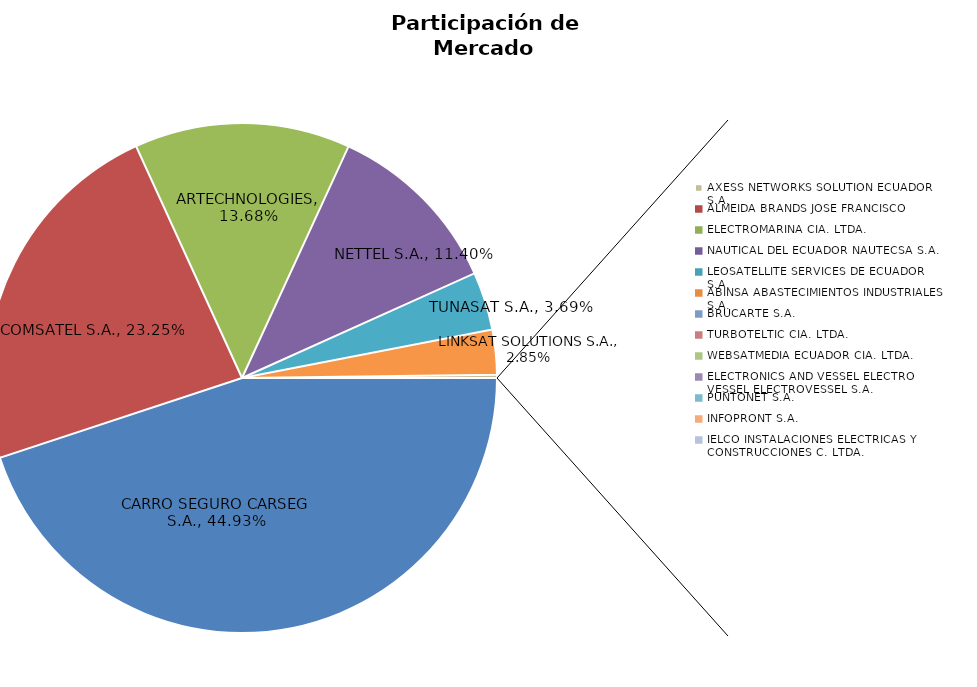
| Category | Series 0 |
|---|---|
| CARRO SEGURO CARSEG S.A. | 0.449 |
| COMSATEL S.A. | 0.233 |
| ARTECHNOLOGIES | 0.137 |
| NETTEL S.A. | 0.114 |
| TUNASAT S.A. | 0.037 |
| LINKSAT SOLUTIONS S.A. | 0.029 |
| AXESS NETWORKS SOLUTION ECUADOR S.A. | 0.002 |
| ALMEIDA BRANDS JOSE FRANCISCO | 0 |
| ELECTROMARINA CIA. LTDA. | 0 |
| NAUTICAL DEL ECUADOR NAUTECSA S.A. | 0 |
| LEOSATELLITE SERVICES DE ECUADOR S.A. | 0 |
| ABINSA ABASTECIMIENTOS INDUSTRIALES S.A. | 0 |
| BRUCARTE S.A. | 0 |
| TURBOTELTIC CIA. LTDA. | 0 |
| WEBSATMEDIA ECUADOR CIA. LTDA. | 0 |
| ELECTRONICS AND VESSEL ELECTRO VESSEL ELECTROVESSEL S.A. | 0 |
| PUNTONET S.A. | 0 |
| INFOPRONT S.A. | 0 |
| IELCO INSTALACIONES ELECTRICAS Y CONSTRUCCIONES C. LTDA. | 0 |